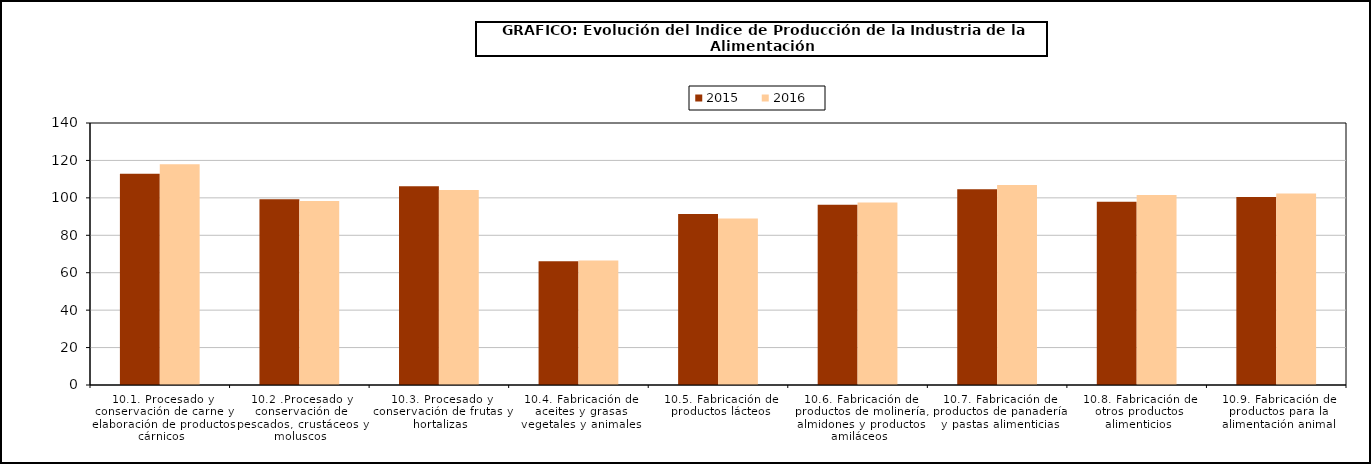
| Category | 2015 | 2016 |
|---|---|---|
| 10.1. Procesado y conservación de carne y elaboración de productos cárnicos | 112.88 | 118.019 |
| 10.2 .Procesado y conservación de pescados, crustáceos y moluscos | 99.216 | 98.354 |
| 10.3. Procesado y conservación de frutas y hortalizas | 106.252 | 104.256 |
| 10.4. Fabricación de aceites y grasas vegetales y animales | 66.169 | 66.484 |
| 10.5. Fabricación de productos lácteos | 91.313 | 88.908 |
| 10.6. Fabricación de productos de molinería, almidones y productos amiláceos | 96.309 | 97.55 |
| 10.7. Fabricación de productos de panadería y pastas alimenticias | 104.604 | 106.822 |
| 10.8. Fabricación de otros productos alimenticios | 97.961 | 101.506 |
| 10.9. Fabricación de productos para la alimentación animal | 100.438 | 102.379 |